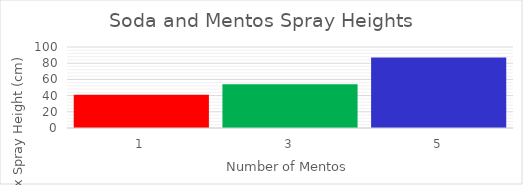
| Category | Avg. Max Spray (cm) |
|---|---|
| 1.0 | 41 |
| 3.0 | 54 |
| 5.0 | 87 |